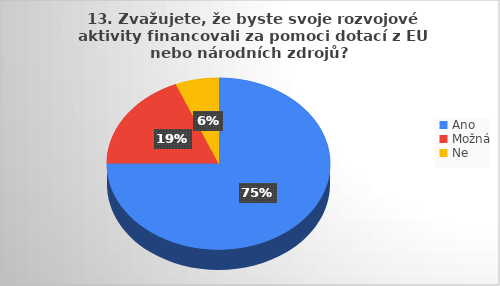
| Category | Series 0 |
|---|---|
| Ano | 12 |
| Možná | 3 |
| Ne | 1 |